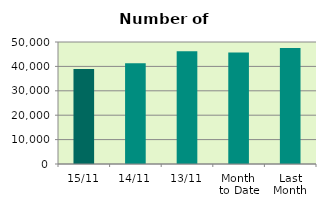
| Category | Series 0 |
|---|---|
| 15/11 | 38972 |
| 14/11 | 41332 |
| 13/11 | 46206 |
| Month 
to Date | 45657.091 |
| Last
Month | 47528 |